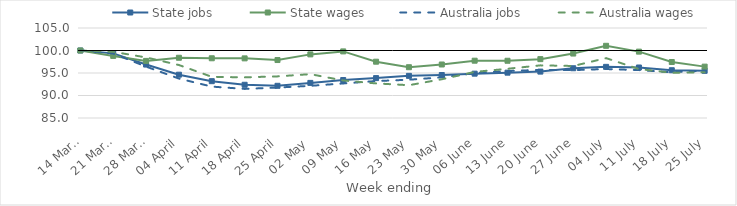
| Category | State jobs | State wages | Australia jobs | Australia wages |
|---|---|---|---|---|
| 2020-03-14 | 100 | 100 | 100 | 100 |
| 2020-03-21 | 99.363 | 98.793 | 99.322 | 99.708 |
| 2020-03-28 | 96.874 | 97.688 | 96.426 | 98.464 |
| 2020-04-04 | 94.623 | 98.386 | 93.761 | 96.774 |
| 2020-04-11 | 93.183 | 98.274 | 91.978 | 94.155 |
| 2020-04-18 | 92.384 | 98.25 | 91.464 | 94.034 |
| 2020-04-25 | 92.154 | 97.881 | 91.766 | 94.248 |
| 2020-05-02 | 92.799 | 99.137 | 92.148 | 94.747 |
| 2020-05-09 | 93.436 | 99.801 | 92.676 | 93.34 |
| 2020-05-16 | 93.865 | 97.511 | 93.207 | 92.686 |
| 2020-05-23 | 94.367 | 96.286 | 93.505 | 92.29 |
| 2020-05-30 | 94.553 | 96.89 | 94.037 | 93.611 |
| 2020-06-06 | 94.853 | 97.734 | 94.972 | 95.238 |
| 2020-06-13 | 95.075 | 97.721 | 95.44 | 95.935 |
| 2020-06-20 | 95.311 | 98.081 | 95.683 | 96.696 |
| 2020-06-27 | 96.056 | 99.321 | 95.641 | 96.56 |
| 2020-07-04 | 96.366 | 101.045 | 95.882 | 98.301 |
| 2020-07-11 | 96.223 | 99.747 | 95.648 | 95.883 |
| 2020-07-18 | 95.615 | 97.444 | 95.158 | 95.058 |
| 2020-07-25 | 95.485 | 96.416 | 95.522 | 95.15 |